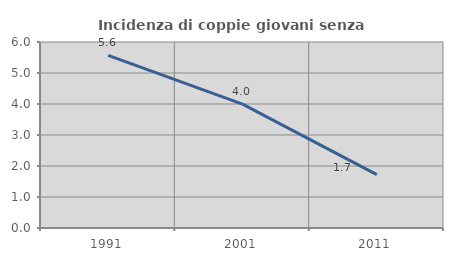
| Category | Incidenza di coppie giovani senza figli |
|---|---|
| 1991.0 | 5.566 |
| 2001.0 | 3.994 |
| 2011.0 | 1.722 |